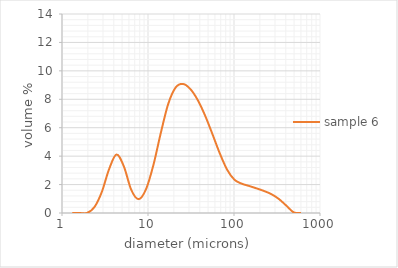
| Category | sample 6 |
|---|---|
| 1.32 | 0 |
| 1.6 | 0 |
| 1.95 | 0 |
| 2.38 | 0.412 |
| 2.9 | 1.473 |
| 3.53 | 3.087 |
| 4.3 | 4.116 |
| 5.24 | 3.278 |
| 6.39 | 1.626 |
| 7.78 | 0.975 |
| 9.48 | 1.672 |
| 11.55 | 3.37 |
| 14.08 | 5.625 |
| 17.15 | 7.657 |
| 20.9 | 8.819 |
| 25.46 | 9.082 |
| 31.01 | 8.727 |
| 37.79 | 7.956 |
| 46.03 | 6.867 |
| 56.09 | 5.555 |
| 68.33 | 4.198 |
| 83.26 | 3.042 |
| 101.44 | 2.336 |
| 123.59 | 2.059 |
| 150.57001 | 1.898 |
| 183.44 | 1.73 |
| 223.50999 | 1.549 |
| 272.31 | 1.324 |
| 331.76999 | 0.99 |
| 404.20999 | 0.527 |
| 492.47 | 0.051 |
| 600.0 | 0 |